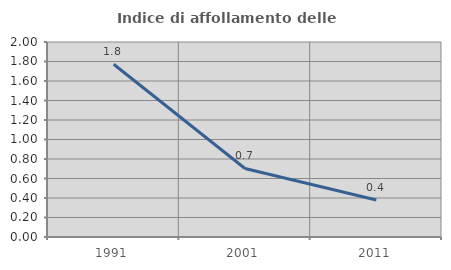
| Category | Indice di affollamento delle abitazioni  |
|---|---|
| 1991.0 | 1.771 |
| 2001.0 | 0.703 |
| 2011.0 | 0.38 |